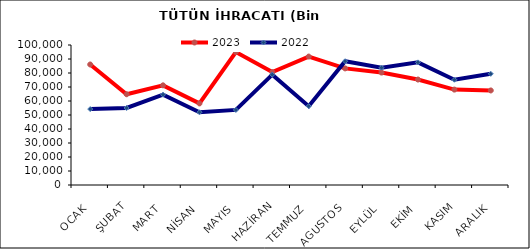
| Category | 2023 | 2022 |
|---|---|---|
| OCAK | 86086.11 | 54248.672 |
| ŞUBAT | 64822.364 | 55002.359 |
| MART | 71187.896 | 64496.354 |
| NİSAN | 58280.475 | 51947.964 |
| MAYIS | 94991.992 | 53632.734 |
| HAZİRAN | 80637.588 | 78822.504 |
| TEMMUZ | 91732.632 | 56311.74 |
| AGUSTOS | 83292.168 | 88413.106 |
| EYLÜL | 80306.922 | 83802.197 |
| EKİM | 75327.553 | 87581.334 |
| KASIM | 68137.909 | 75182.391 |
| ARALIK | 67533.291 | 79429.708 |